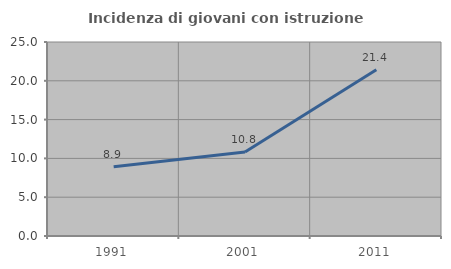
| Category | Incidenza di giovani con istruzione universitaria |
|---|---|
| 1991.0 | 8.911 |
| 2001.0 | 10.833 |
| 2011.0 | 21.429 |